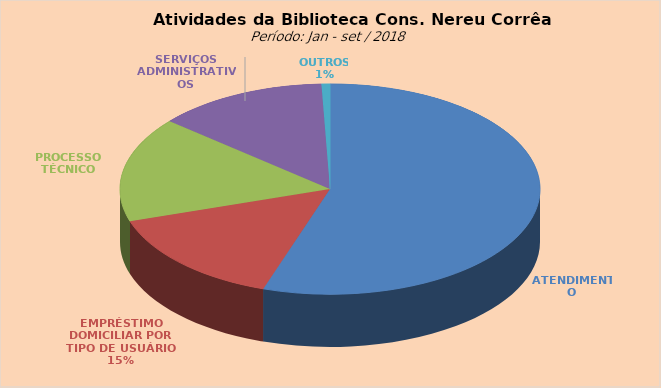
| Category | Series 0 |
|---|---|
| ATENDIMENTO | 10441 |
| EMPRÉSTIMO DOMICILIAR POR TIPO DE USUÁRIO | 2826 |
| PROCESSO TÉCNICO | 3054 |
| SERVIÇOS ADMINISTRATIVOS | 2490 |
| OUTROS | 124 |